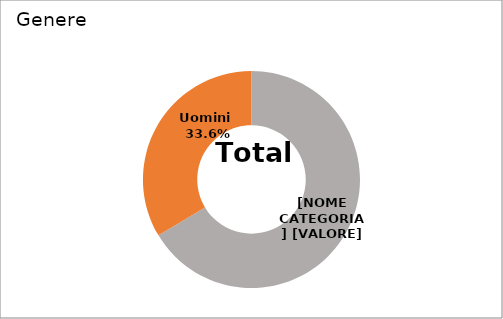
| Category | Series 0 |
|---|---|
| Donne  | 0.664 |
| Uomini  | 0.336 |